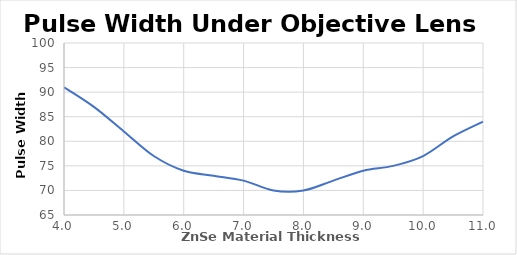
| Category | After Installing the FSPC17 Pulse Compressor |
|---|---|
| 4.0 | 91 |
| 4.5 | 87 |
| 5.0 | 82 |
| 5.5 | 77 |
| 6.0 | 74 |
| 6.5 | 73 |
| 7.0 | 72 |
| 7.5 | 70 |
| 8.0 | 70 |
| 8.5 | 72 |
| 9.0 | 74 |
| 9.5 | 75 |
| 10.0 | 77 |
| 10.5 | 81 |
| 11.0 | 84 |